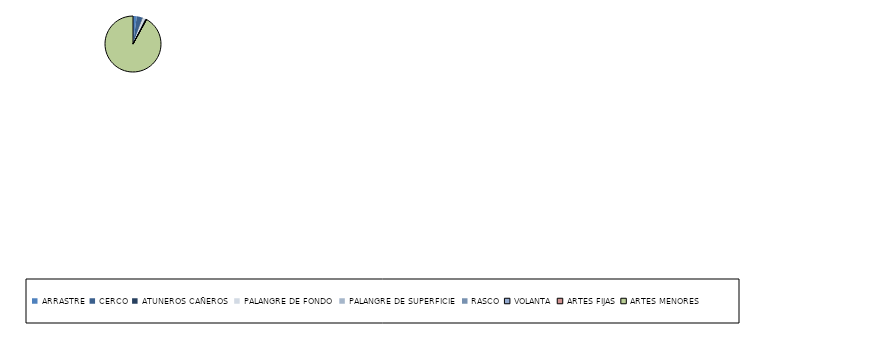
| Category | Series 0 |
|---|---|
| ARRASTRE | 6 |
| CERCO | 9 |
| ATUNEROS CAÑEROS | 1 |
| PALANGRE DE FONDO | 3 |
| PALANGRE DE SUPERFICIE | 1 |
| RASCO | 1 |
| VOLANTA | 1 |
| ARTES FIJAS | 0 |
| ARTES MENORES | 253 |